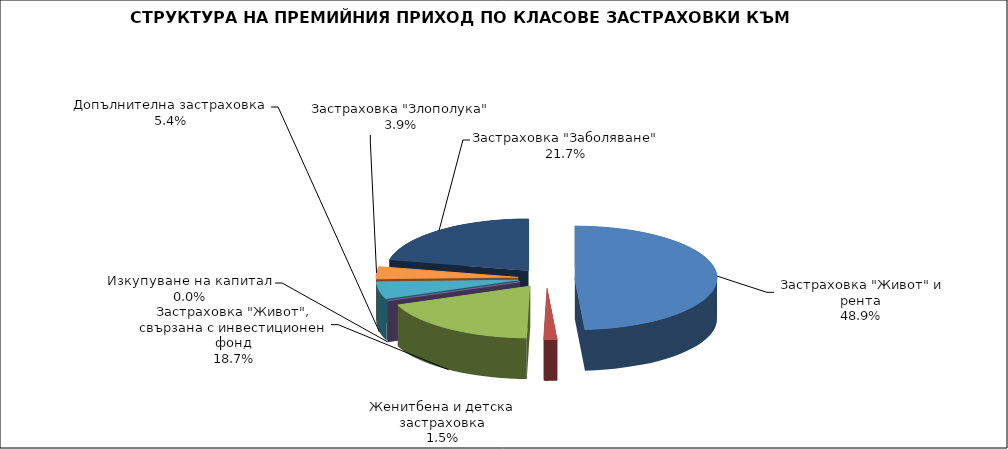
| Category |  Застраховка "Живот" и рента |
|---|---|
|  Застраховка "Живот" и рента | 184567150.405 |
| Женитбена и детска застраховка | 5720971.41 |
| Застраховка "Живот", свързана с инвестиционен фонд | 70507038.116 |
| Изкупуване на капитал | 0 |
| Допълнителна застраховка | 20424259.561 |
| Застраховка "Злополука" | 14592540.456 |
| Застраховка "Заболяване" | 81911707.16 |